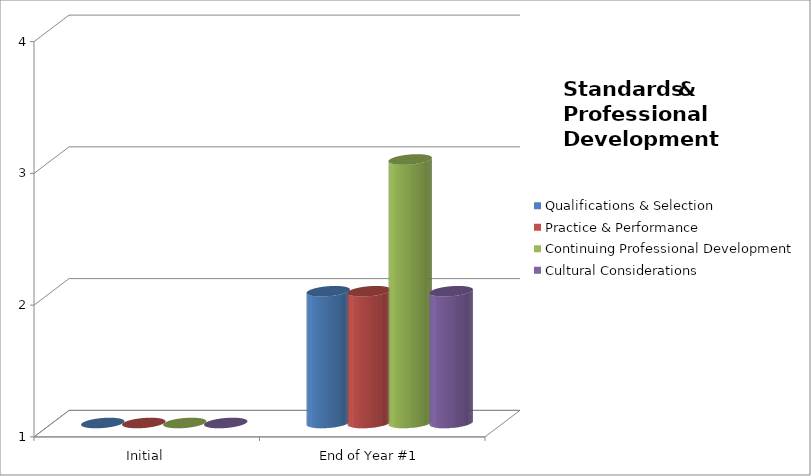
| Category | Qualifications & Selection  | Practice & Performance  | Continuing Professional Development  | Cultural Considerations  |
|---|---|---|---|---|
| Initial | 1 | 1 | 1 | 1 |
| End of Year #1 | 2 | 2 | 3 | 2 |